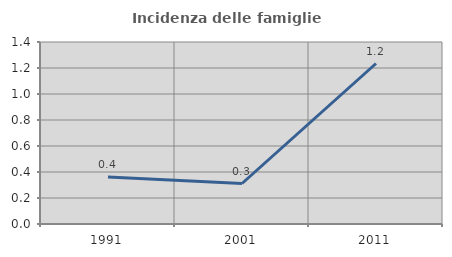
| Category | Incidenza delle famiglie numerose |
|---|---|
| 1991.0 | 0.361 |
| 2001.0 | 0.312 |
| 2011.0 | 1.235 |